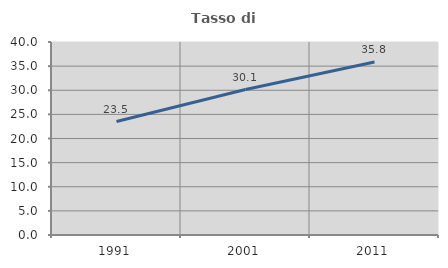
| Category | Tasso di occupazione   |
|---|---|
| 1991.0 | 23.517 |
| 2001.0 | 30.142 |
| 2011.0 | 35.84 |